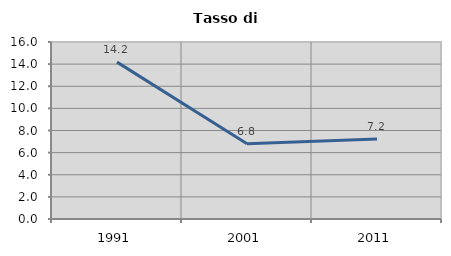
| Category | Tasso di disoccupazione   |
|---|---|
| 1991.0 | 14.179 |
| 2001.0 | 6.806 |
| 2011.0 | 7.222 |